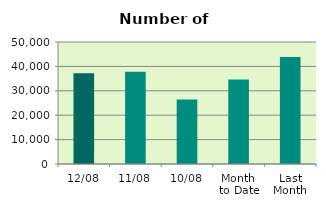
| Category | Series 0 |
|---|---|
| 12/08 | 37228 |
| 11/08 | 37778 |
| 10/08 | 26414 |
| Month 
to Date | 34583.5 |
| Last
Month | 43867.217 |